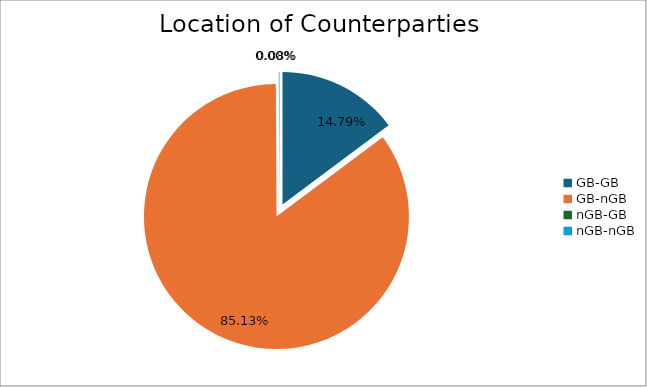
| Category | Series 0 |
|---|---|
| GB-GB | 1738087.315 |
| GB-nGB | 10002351.809 |
| nGB-GB | 0 |
| nGB-nGB | 9683.286 |